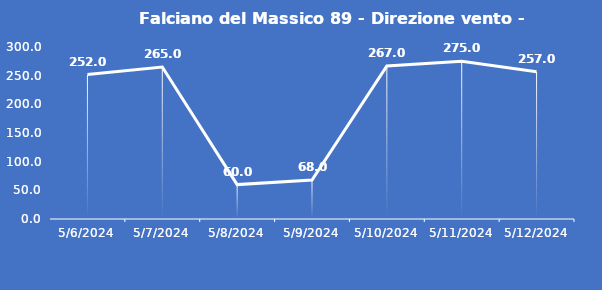
| Category | Falciano del Massico 89 - Direzione vento - Grezzo (°N) |
|---|---|
| 5/6/24 | 252 |
| 5/7/24 | 265 |
| 5/8/24 | 60 |
| 5/9/24 | 68 |
| 5/10/24 | 267 |
| 5/11/24 | 275 |
| 5/12/24 | 257 |